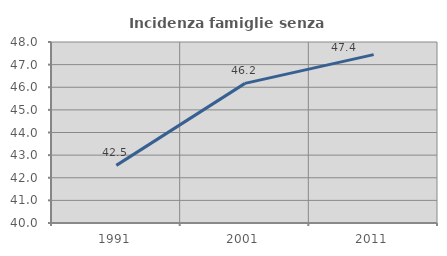
| Category | Incidenza famiglie senza nuclei |
|---|---|
| 1991.0 | 42.547 |
| 2001.0 | 46.171 |
| 2011.0 | 47.444 |